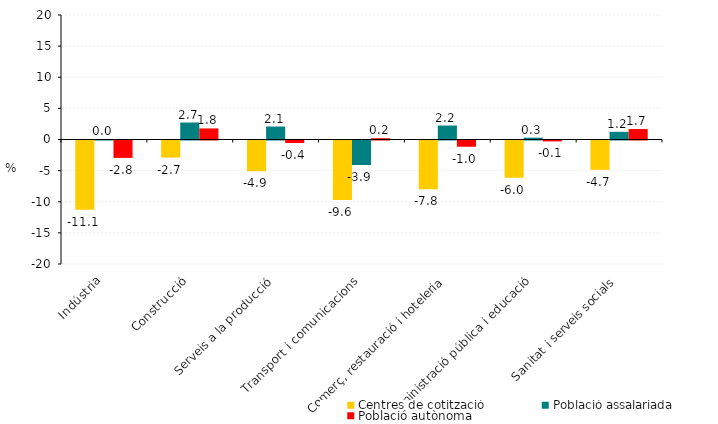
| Category | Centres de cotització | Població assalariada | Població autònoma |
|---|---|---|---|
| Indústria | -11.111 | 0.016 | -2.795 |
| Construcció | -2.737 | 2.726 | 1.78 |
| Serveis a la producció | -4.941 | 2.084 | -0.407 |
| Transport i comunicacions | -9.561 | -3.939 | 0.207 |
| Comerç, restauració i hoteleria | -7.837 | 2.245 | -1.002 |
| Administració pública i educació | -5.982 | 0.297 | -0.149 |
| Sanitat i serveis socials | -4.711 | 1.233 | 1.679 |